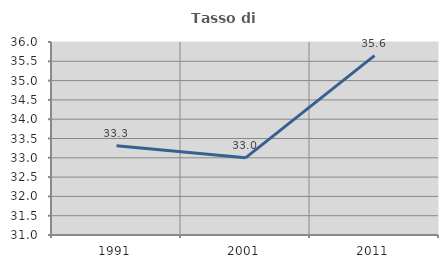
| Category | Tasso di occupazione   |
|---|---|
| 1991.0 | 33.31 |
| 2001.0 | 32.999 |
| 2011.0 | 35.645 |